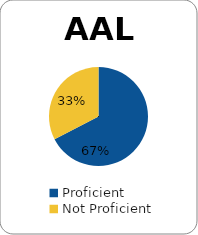
| Category | Series 0 |
|---|---|
| Proficient | 0.674 |
| Not Proficient | 0.326 |